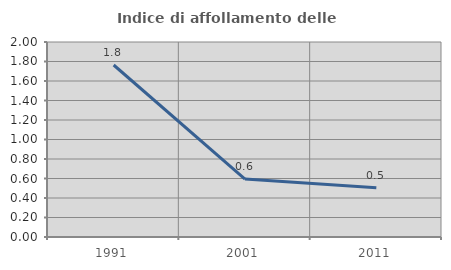
| Category | Indice di affollamento delle abitazioni  |
|---|---|
| 1991.0 | 1.764 |
| 2001.0 | 0.594 |
| 2011.0 | 0.505 |